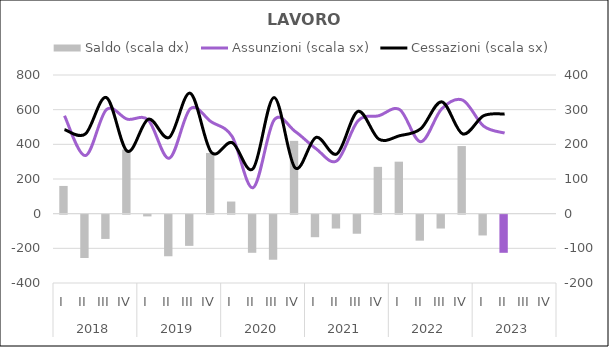
| Category | Saldo (scala dx) |
|---|---|
| 0 | 80 |
| 1 | -125 |
| 2 | -70 |
| 3 | 185 |
| 4 | -5 |
| 5 | -120 |
| 6 | -90 |
| 7 | 175 |
| 8 | 35 |
| 9 | -110 |
| 10 | -130 |
| 11 | 210 |
| 12 | -65 |
| 13 | -40 |
| 14 | -55 |
| 15 | 135 |
| 16 | 150 |
| 17 | -75 |
| 18 | -40 |
| 19 | 195 |
| 20 | -60 |
| 21 | -110 |
| 22 | 0 |
| 23 | 0 |